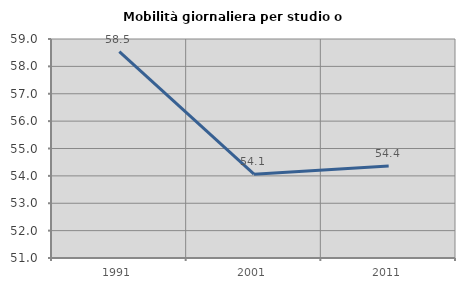
| Category | Mobilità giornaliera per studio o lavoro |
|---|---|
| 1991.0 | 58.537 |
| 2001.0 | 54.064 |
| 2011.0 | 54.362 |